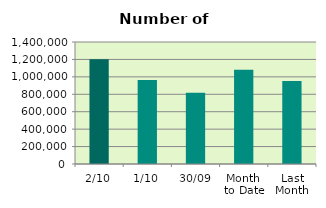
| Category | Series 0 |
|---|---|
| 2/10 | 1202024 |
| 1/10 | 963282 |
| 30/09 | 818450 |
| Month 
to Date | 1082653 |
| Last
Month | 952931.048 |